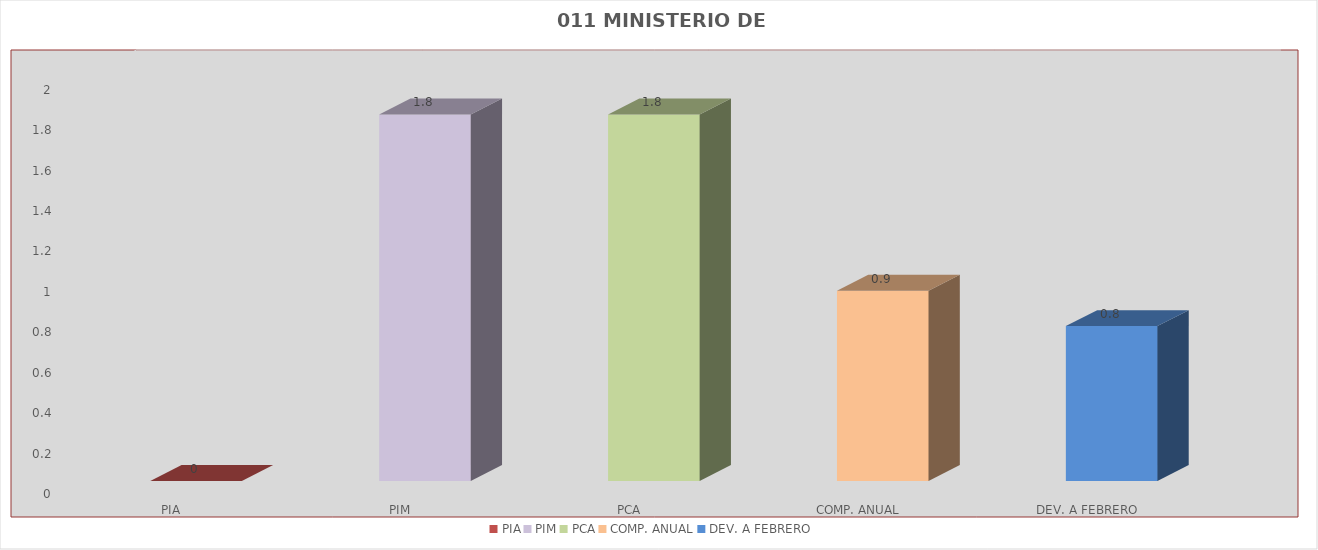
| Category | 011 MINISTERIO DE SALUD |
|---|---|
| PIA | 0 |
| PIM | 1.813 |
| PCA | 1.813 |
| COMP. ANUAL | 0.941 |
| DEV. A FEBRERO | 0.766 |